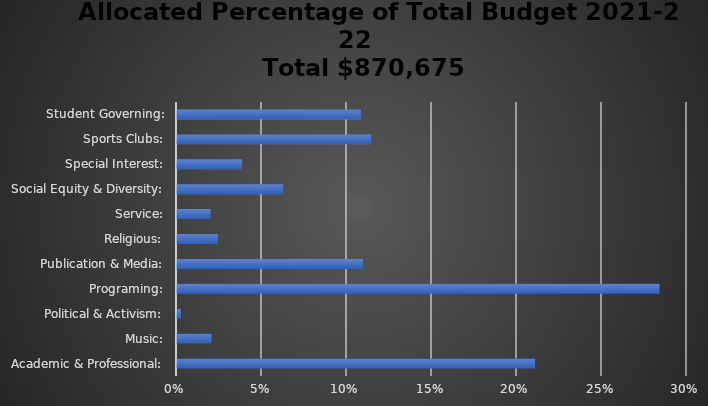
| Category | Series 0 |
|---|---|
| Academic & Professional: | 0.211 |
| Music: | 0.021 |
| Political & Activism: | 0.003 |
| Programing: | 0.284 |
| Publication & Media: | 0.11 |
| Religious: | 0.025 |
| Service: | 0.02 |
| Social Equity & Diversity: | 0.063 |
| Special Interest: | 0.039 |
| Sports Clubs: | 0.115 |
| Student Governing: | 0.109 |